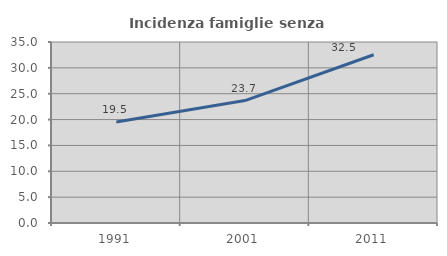
| Category | Incidenza famiglie senza nuclei |
|---|---|
| 1991.0 | 19.541 |
| 2001.0 | 23.673 |
| 2011.0 | 32.534 |